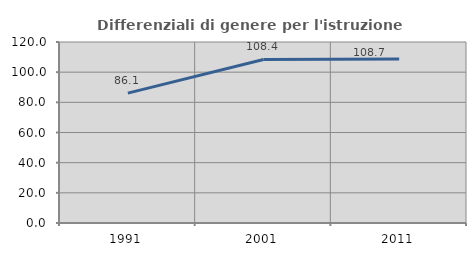
| Category | Differenziali di genere per l'istruzione superiore |
|---|---|
| 1991.0 | 86.115 |
| 2001.0 | 108.4 |
| 2011.0 | 108.682 |